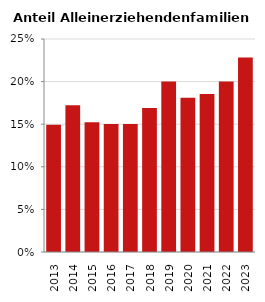
| Category | Anteil Alleinerziehende an Familien |
|---|---|
| 2013.0 | 0.149 |
| 2014.0 | 0.172 |
| 2015.0 | 0.152 |
| 2016.0 | 0.15 |
| 2017.0 | 0.15 |
| 2018.0 | 0.169 |
| 2019.0 | 0.2 |
| 2020.0 | 0.181 |
| 2021.0 | 0.185 |
| 2022.0 | 0.2 |
| 2023.0 | 0.228 |